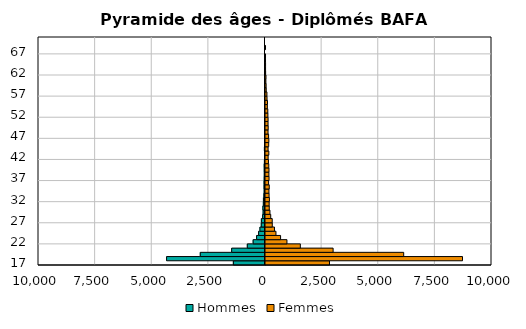
| Category | Hommes | Femmes |
|---|---|---|
| 17.0 | -1397 | 2825 |
| 18.0 | -4345 | 8698 |
| 19.0 | -2858 | 6101 |
| 20.0 | -1472 | 2985 |
| 21.0 | -781 | 1538 |
| 22.0 | -524 | 947 |
| 23.0 | -371 | 666 |
| 24.0 | -282 | 462 |
| 25.0 | -224 | 396 |
| 26.0 | -165 | 299 |
| 27.0 | -160 | 297 |
| 28.0 | -104 | 231 |
| 29.0 | -83 | 196 |
| 30.0 | -94 | 166 |
| 31.0 | -73 | 162 |
| 32.0 | -69 | 172 |
| 33.0 | -51 | 158 |
| 34.0 | -37 | 152 |
| 35.0 | -43 | 166 |
| 36.0 | -43 | 136 |
| 37.0 | -36 | 157 |
| 38.0 | -32 | 151 |
| 39.0 | -34 | 154 |
| 40.0 | -36 | 145 |
| 41.0 | -26 | 131 |
| 42.0 | -16 | 116 |
| 43.0 | -20 | 147 |
| 44.0 | -26 | 114 |
| 45.0 | -10 | 141 |
| 46.0 | -16 | 148 |
| 47.0 | -11 | 137 |
| 48.0 | -17 | 112 |
| 49.0 | -14 | 119 |
| 50.0 | -13 | 113 |
| 51.0 | -6 | 114 |
| 52.0 | -6 | 106 |
| 53.0 | -9 | 102 |
| 54.0 | -6 | 82 |
| 55.0 | -10 | 88 |
| 56.0 | -11 | 67 |
| 57.0 | -1 | 63 |
| 58.0 | -4 | 32 |
| 59.0 | -4 | 27 |
| 60.0 | -1 | 17 |
| 61.0 | -6 | 22 |
| 62.0 | -2 | 6 |
| 63.0 | 0 | 3 |
| 64.0 | 0 | 3 |
| 65.0 | 0 | 1 |
| 66.0 | 0 | 1 |
| 67.0 | 0 | 0 |
| 68.0 | 0 | 1 |
| 69.0 | 0 | 0 |
| 70.0 | 0 | 0 |